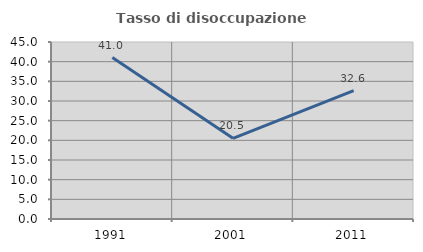
| Category | Tasso di disoccupazione giovanile  |
|---|---|
| 1991.0 | 41.038 |
| 2001.0 | 20.513 |
| 2011.0 | 32.632 |